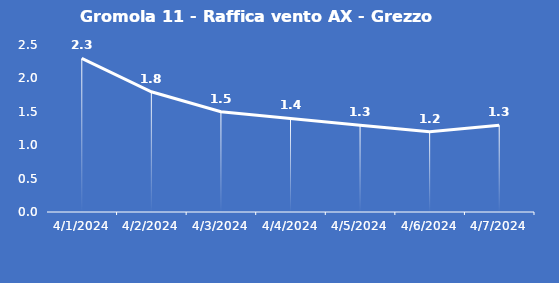
| Category | Gromola 11 - Raffica vento AX - Grezzo (m/s) |
|---|---|
| 4/1/24 | 2.3 |
| 4/2/24 | 1.8 |
| 4/3/24 | 1.5 |
| 4/4/24 | 1.4 |
| 4/5/24 | 1.3 |
| 4/6/24 | 1.2 |
| 4/7/24 | 1.3 |